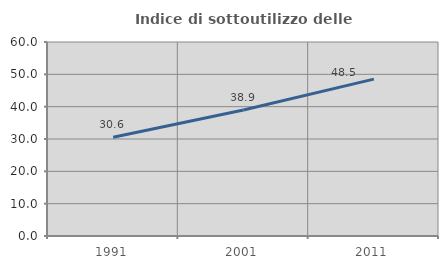
| Category | Indice di sottoutilizzo delle abitazioni  |
|---|---|
| 1991.0 | 30.568 |
| 2001.0 | 38.95 |
| 2011.0 | 48.526 |